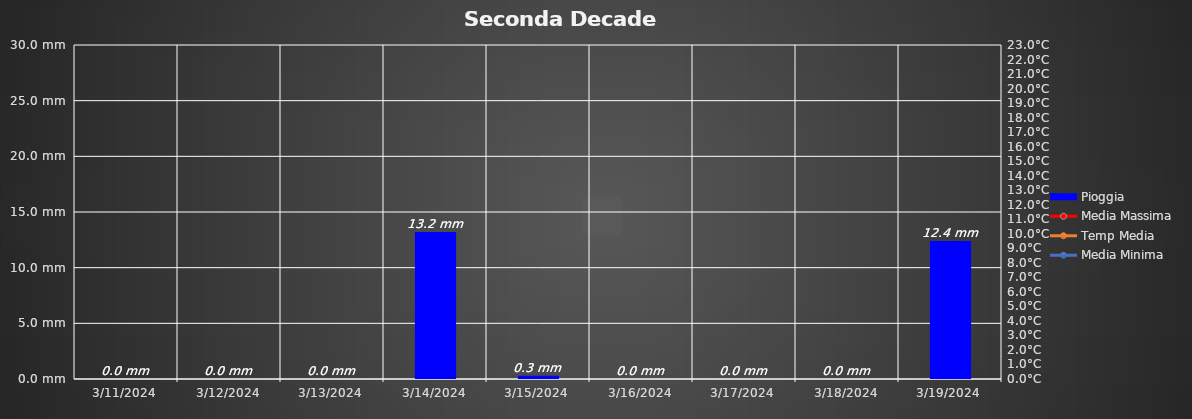
| Category | Pioggia |
|---|---|
| 3/11/24 | 0 |
| 3/12/24 | 0 |
| 3/13/24 | 0 |
| 3/14/24 | 1900-01-13 04:48:00 |
| 3/15/24 | 0.3 |
| 3/16/24 | 0 |
| 3/17/24 | 0 |
| 3/18/24 | 0 |
| 3/19/24 | 1900-01-12 09:36:00 |